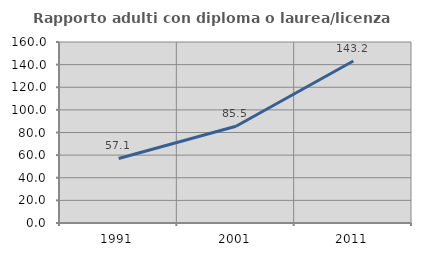
| Category | Rapporto adulti con diploma o laurea/licenza media  |
|---|---|
| 1991.0 | 57.051 |
| 2001.0 | 85.542 |
| 2011.0 | 143.2 |